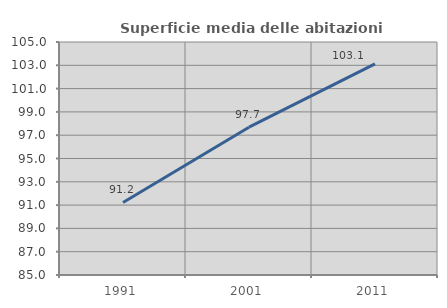
| Category | Superficie media delle abitazioni occupate |
|---|---|
| 1991.0 | 91.23 |
| 2001.0 | 97.688 |
| 2011.0 | 103.117 |